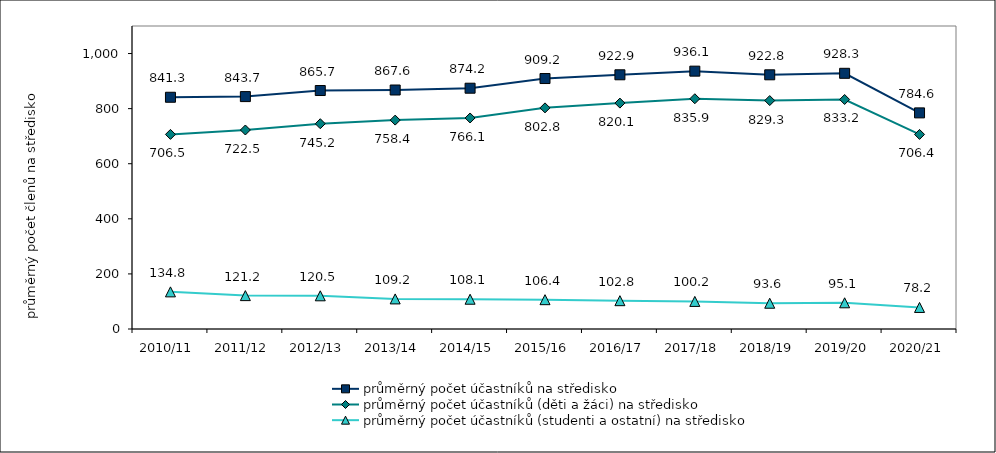
| Category | průměrný počet účastníků na středisko | průměrný počet účastníků (děti a žáci) na středisko | průměrný počet účastníků (studenti a ostatní) na středisko |
|---|---|---|---|
| 2010/11 | 841.302 | 706.492 | 134.811 |
| 2011/12 | 843.672 | 722.483 | 121.189 |
| 2012/13 | 865.739 | 745.229 | 120.51 |
| 2013/14 | 867.625 | 758.397 | 109.228 |
| 2014/15 | 874.179 | 766.106 | 108.074 |
| 2015/16 | 909.238 | 802.799 | 106.439 |
| 2016/17 | 922.891 | 820.081 | 102.81 |
| 2017/18 | 936.077 | 835.926 | 100.151 |
| 2018/19 | 922.845 | 829.288 | 93.558 |
| 2019/20 | 928.272 | 833.198 | 95.075 |
| 2020/21 | 784.589 | 706.363 | 78.225 |